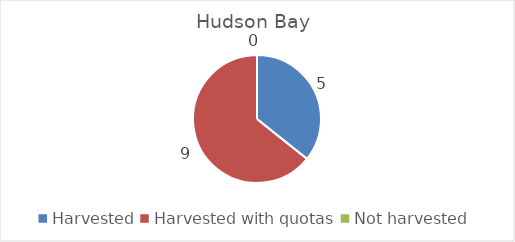
| Category | Hudson Bay |
|---|---|
| Harvested | 5 |
| Harvested with quotas | 9 |
| Not harvested | 0 |